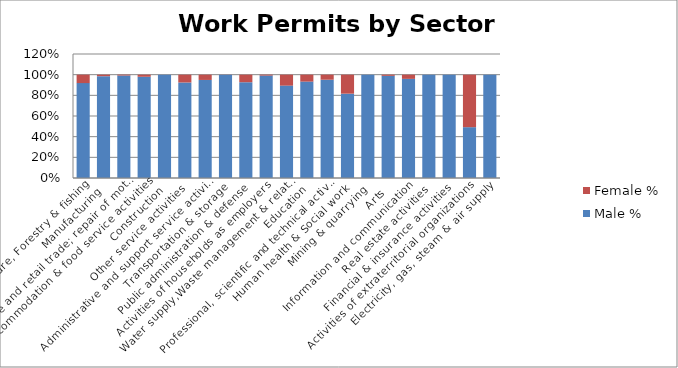
| Category | Male % | Female % |
|---|---|---|
| Agriculture, Forestry & fishing | 0.918 | 0.082 |
|  Manufacturing | 0.985 | 0.015 |
|  Wholesale and retail trade; repair of motor vehicles  | 0.992 | 0.008 |
|   Accommodation & food service activities | 0.98 | 0.02 |
|   Construction | 1 | 0 |
| Other service activities | 0.924 | 0.076 |
| Administrative and support service activities | 0.949 | 0.051 |
|   Transportation & storage | 0.999 | 0.001 |
| Public administration & defense | 0.927 | 0.073 |
| Activities of households as employers | 0.991 | 0.009 |
| Water supply,Waste management & related activities | 0.894 | 0.106 |
| Education | 0.933 | 0.067 |
| Professional, scientific and technical activities | 0.951 | 0.049 |
| Human health & Social work | 0.816 | 0.184 |
| Mining & quarrying | 1 | 0 |
| Arts | 0.989 | 0.011 |
|  Information and communication | 0.959 | 0.041 |
| Real estate activities | 1 | 0 |
|  Financial & insurance activities | 1 | 0 |
| Activities of extraterritorial organizations  | 0.492 | 0.508 |
| Electricity, gas, steam & air supply | 1 | 0 |